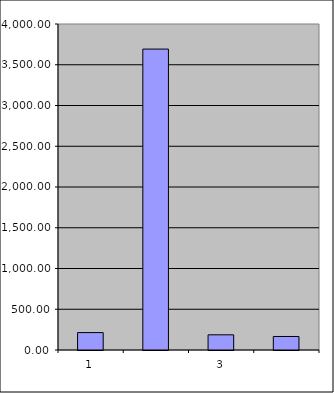
| Category | Series 0 |
|---|---|
| 0 | 213.75 |
| 1 | 3692.2 |
| 2 | 186.265 |
| 3 | 165.776 |